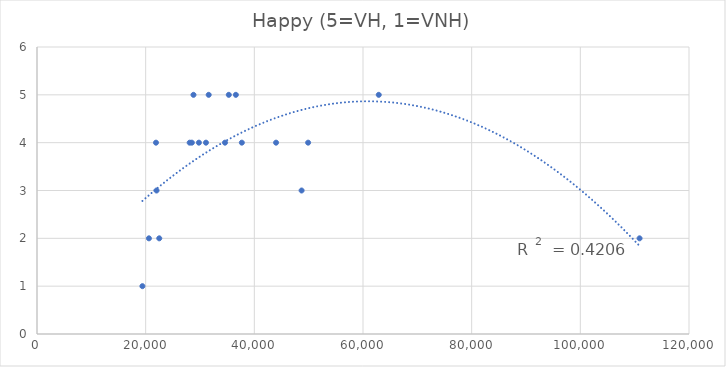
| Category | Happy (5=VH, 1=VNH) |
|---|---|
| 28800.0 | 5 |
| 36600.0 | 5 |
| 44000.0 | 4 |
| 21900.0 | 4 |
| 22500.0 | 2 |
| 19400.0 | 1 |
| 28500.0 | 4 |
| 48700.0 | 3 |
| 35300.0 | 5 |
| 28100.0 | 4 |
| 31600.0 | 5 |
| 34600.0 | 4 |
| 49900.0 | 4 |
| 110900.0 | 2 |
| 22000.0 | 3 |
| 29800.0 | 4 |
| 37700.0 | 4 |
| 31100.0 | 4 |
| 20600.0 | 2 |
| 62900.0 | 5 |